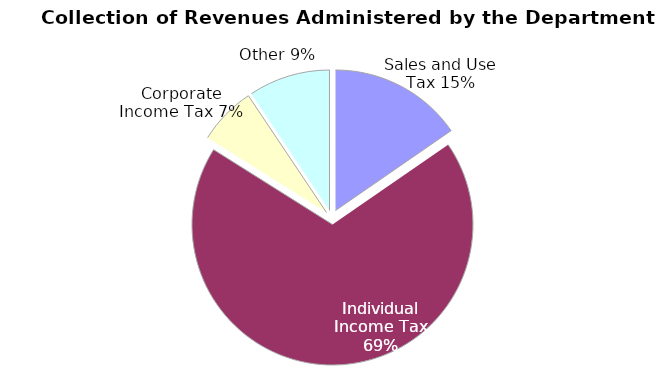
| Category | FY 2022 |
|---|---|
| 0 | 4558082000 |
| 1 | 20324954000 |
| 2 | 1978697000 |
| 3 | 2782131000 |